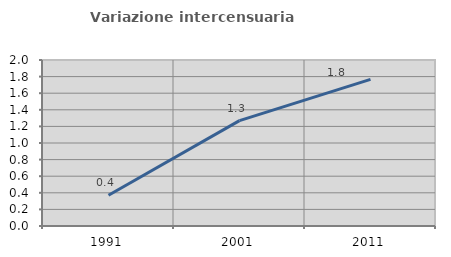
| Category | Variazione intercensuaria annua |
|---|---|
| 1991.0 | 0.37 |
| 2001.0 | 1.27 |
| 2011.0 | 1.766 |